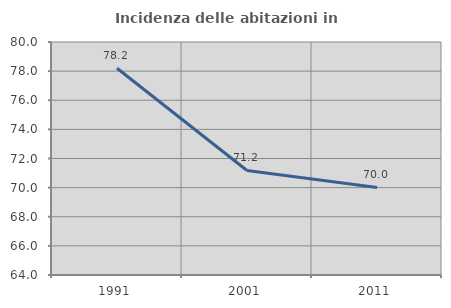
| Category | Incidenza delle abitazioni in proprietà  |
|---|---|
| 1991.0 | 78.196 |
| 2001.0 | 71.178 |
| 2011.0 | 70.016 |